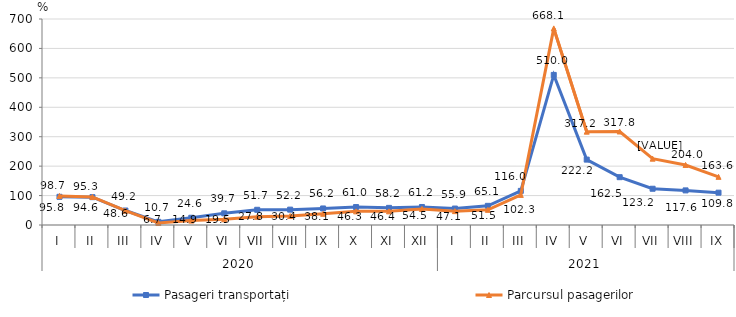
| Category | Pasageri transportați | Parcursul pasagerilor |
|---|---|---|
| 0 | 95.8 | 98.7 |
| 1 | 94.6 | 95.3 |
| 2 | 49.2 | 48.6 |
| 3 | 10.7 | 6.7 |
| 4 | 24.6 | 14.9 |
| 5 | 39.7 | 19.5 |
| 6 | 51.7 | 27.8 |
| 7 | 52.2 | 30.4 |
| 8 | 56.2 | 38.1 |
| 9 | 61 | 46.3 |
| 10 | 58.2 | 46.4 |
| 11 | 61.2 | 54.5 |
| 12 | 55.9 | 47.1 |
| 13 | 65.1 | 51.5 |
| 14 | 116 | 102.3 |
| 15 | 510 | 668.1 |
| 16 | 222.2 | 317.2 |
| 17 | 162.5 | 317.8 |
| 18 | 123.2 | 225.4 |
| 19 | 117.6 | 204 |
| 20 | 109.8 | 163.6 |